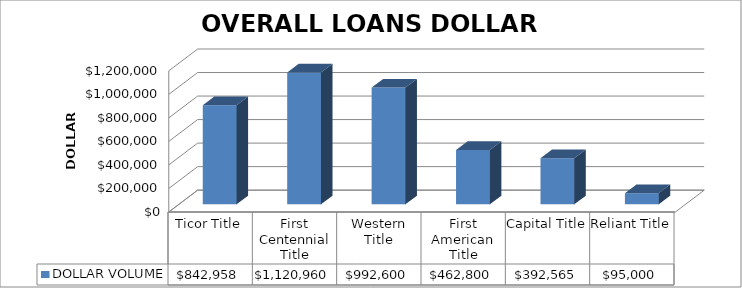
| Category | DOLLAR VOLUME |
|---|---|
| Ticor Title | 842958.3 |
| First Centennial Title | 1120960 |
| Western Title | 992600 |
| First American Title | 462800 |
| Capital Title | 392565 |
| Reliant Title | 95000 |